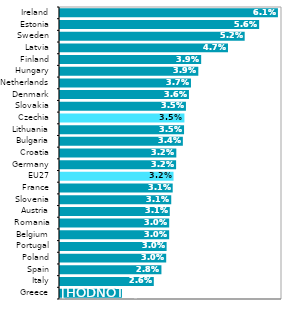
| Category | Series 0 |
|---|---|
| Greece | 0.017 |
| Italy | 0.026 |
| Spain | 0.028 |
| Poland | 0.03 |
| Portugal | 0.03 |
| Belgium | 0.03 |
| Romania | 0.03 |
| Austria | 0.031 |
| Slovenia | 0.031 |
| France | 0.031 |
| EU27 | 0.032 |
| Germany | 0.032 |
| Croatia | 0.032 |
| Bulgaria | 0.034 |
| Lithuania | 0.035 |
| Czechia | 0.035 |
| Slovakia | 0.035 |
| Denmark | 0.036 |
| Netherlands | 0.037 |
| Hungary | 0.039 |
| Finland | 0.039 |
| Latvia | 0.047 |
| Sweden | 0.052 |
| Estonia | 0.056 |
| Ireland | 0.061 |